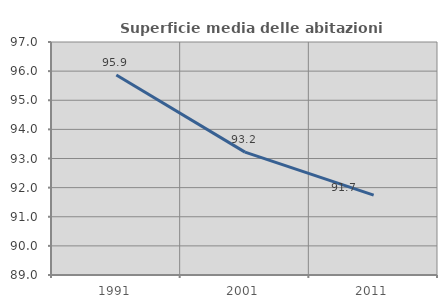
| Category | Superficie media delle abitazioni occupate |
|---|---|
| 1991.0 | 95.866 |
| 2001.0 | 93.219 |
| 2011.0 | 91.743 |